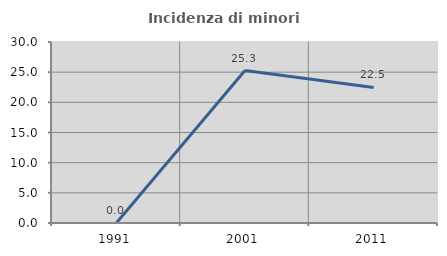
| Category | Incidenza di minori stranieri |
|---|---|
| 1991.0 | 0 |
| 2001.0 | 25.263 |
| 2011.0 | 22.477 |